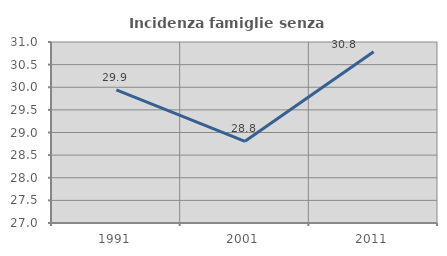
| Category | Incidenza famiglie senza nuclei |
|---|---|
| 1991.0 | 29.944 |
| 2001.0 | 28.804 |
| 2011.0 | 30.783 |